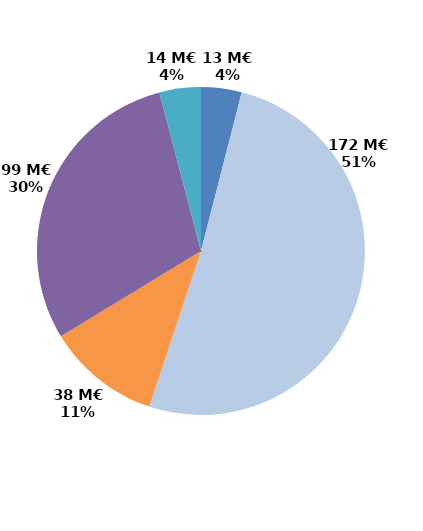
| Category | Series 0 |
|---|---|
| Contrats aidés marchand (hors IAE) | 13.43 |
| Contrats aidés non marchand (hors IAE) | 171.619 |
| Insertion par l'activité économique | 37.565 |
| Mesures en faveur des handicapés | 99.456 |
| Autres emplois aidés | 13.721 |